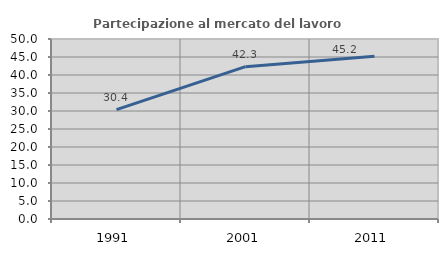
| Category | Partecipazione al mercato del lavoro  femminile |
|---|---|
| 1991.0 | 30.38 |
| 2001.0 | 42.308 |
| 2011.0 | 45.205 |